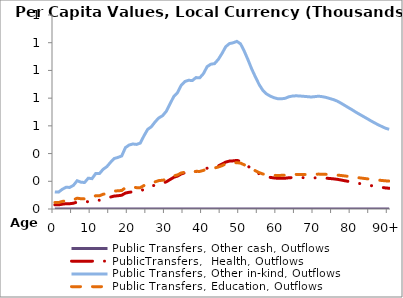
| Category | Public Transfers, Other cash, Outflows | PublicTransfers,  Health, Outflows | Public Transfers, Other in-kind, Outflows | Public Transfers, Education, Outflows |
|---|---|---|---|---|
| 0 |  | 29.977 | 122.667 | 46.943 |
|  |  | 29.762 | 121.83 | 46.614 |
| 2 |  | 34.77 | 142.399 | 54.471 |
| 3 |  | 38.204 | 156.485 | 59.855 |
| 4 |  | 38.056 | 155.838 | 59.615 |
| 5 |  | 41.678 | 170.692 | 65.293 |
| 6 |  | 49.822 | 204.118 | 78.064 |
| 7 |  | 47.31 | 193.723 | 74.108 |
| 8 |  | 46.733 | 191.2 | 73.11 |
| 9 |  | 54.601 | 222.374 | 84.401 |
| 10 |  | 54.232 | 219.038 | 82.186 |
| 11 |  | 63.451 | 256.123 | 95.94 |
| 12 |  | 63.365 | 255.401 | 95.537 |
| 13 |  | 71.364 | 286.528 | 106.535 |
| 14 |  | 77.421 | 305.698 | 110.754 |
| 15 |  | 86.483 | 336.985 | 119.435 |
| 16 |  | 93.373 | 364.538 | 129.601 |
| 17 |  | 95.809 | 372.371 | 131.421 |
| 18 |  | 99.213 | 382.782 | 133.485 |
| 19 |  | 115.068 | 442.903 | 153.7 |
| 20 |  | 120.641 | 461.679 | 158.59 |
| 21 |  | 123.717 | 469.229 | 158.6 |
| 22 |  | 124.379 | 466.078 | 154.096 |
| 23 |  | 128.347 | 475.794 | 154.154 |
| 24 |  | 143.286 | 528.465 | 169.401 |
| 25 |  | 157.11 | 574.999 | 181.446 |
| 26 |  | 163.478 | 593.949 | 184.658 |
| 27 |  | 172.971 | 629.223 | 196.057 |
| 28 |  | 180.546 | 657.438 | 205.234 |
| 29 |  | 186.113 | 673.353 | 207.396 |
| 30 |  | 196.298 | 705.022 | 213.726 |
| 31 |  | 212.399 | 758.23 | 226.698 |
| 32 |  | 228.591 | 810.837 | 238.923 |
| 33 |  | 237.298 | 839.263 | 245.623 |
| 34 |  | 252.478 | 891.478 | 259.827 |
| 35 |  | 261.772 | 919.933 | 265.207 |
| 36 |  | 264.491 | 929.165 | 267.631 |
| 37 |  | 264.281 | 926.73 | 265.854 |
| 38 |  | 270.555 | 948.32 | 271.778 |
| 39 |  | 270.137 | 946.653 | 271.195 |
| 40 |  | 279.323 | 976.756 | 278.441 |
| 41 |  | 294.667 | 1027.334 | 290.843 |
| 42 |  | 299.988 | 1044.977 | 295.299 |
| 43 |  | 301.399 | 1049.15 | 296.051 |
| 44 |  | 310.819 | 1079.514 | 303.048 |
| 45 |  | 324.146 | 1122.187 | 312.608 |
| 46 |  | 338.463 | 1170.939 | 325.621 |
| 47 |  | 345.749 | 1193.713 | 330.352 |
| 48 |  | 347.407 | 1199.473 | 332.032 |
| 49 |  | 350.457 | 1209.759 | 334.748 |
| 50 |  | 344.705 | 1191.504 | 330.867 |
| 51 |  | 328.315 | 1138.478 | 318.675 |
| 52 |  | 309.039 | 1076.856 | 305.041 |
| 53 |  | 288.593 | 1010.339 | 289.526 |
| 54 |  | 270.933 | 952.489 | 275.789 |
| 55 |  | 254.381 | 898.064 | 262.727 |
| 56 |  | 241.557 | 855.911 | 252.633 |
| 57 |  | 233.394 | 830.243 | 247.345 |
| 58 |  | 227.984 | 814.435 | 244.999 |
| 59 |  | 224.331 | 803.234 | 242.977 |
| 60 |  | 221.711 | 795.828 | 242.133 |
| 61 |  | 221.199 | 795.162 | 242.757 |
| 62 |  | 222.189 | 798.915 | 244.103 |
| 63 |  | 225.397 | 809.693 | 246.983 |
| 64 |  | 226.839 | 815.267 | 249.027 |
| 65 |  | 227.244 | 816.839 | 249.693 |
| 66 |  | 226.695 | 815.28 | 249.592 |
| 67 |  | 226.104 | 813.072 | 248.99 |
| 68 |  | 225.127 | 810.738 | 249.115 |
| 69 |  | 224.01 | 808.281 | 249.398 |
| 70 |  | 224.608 | 810.903 | 250.574 |
| 71 |  | 225.425 | 814.108 | 251.783 |
| 72 |  | 224.24 | 810.53 | 251.215 |
| 73 |  | 222.623 | 805.421 | 250.204 |
| 74 |  | 220.142 | 797.451 | 248.481 |
| 75 |  | 217.596 | 789.356 | 246.781 |
| 76 |  | 214.282 | 779.012 | 244.73 |
| 77 |  | 209.482 | 764.253 | 241.93 |
| 78 |  | 204.275 | 748.102 | 238.748 |
| 79 |  | 199.154 | 732.036 | 235.434 |
| 80 |  | 194.283 | 716.521 | 232.051 |
| 81 |  | 188.876 | 699.371 | 228.349 |
| 82 |  | 184.077 | 683.991 | 224.906 |
| 83 |  | 179.244 | 668.566 | 221.496 |
| 84 |  | 174.446 | 653.343 | 218.191 |
| 85 |  | 169.426 | 637.516 | 214.796 |
| 86 |  | 164.708 | 622.67 | 211.64 |
| 87 |  | 160.23 | 608.578 | 208.658 |
| 88 |  | 156.104 | 595.597 | 205.914 |
| 89 |  | 152.187 | 583.261 | 203.299 |
| 90+ |  | 149.524 | 574.838 | 201.487 |